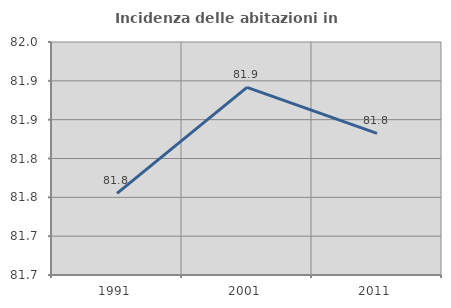
| Category | Incidenza delle abitazioni in proprietà  |
|---|---|
| 1991.0 | 81.755 |
| 2001.0 | 81.892 |
| 2011.0 | 81.832 |